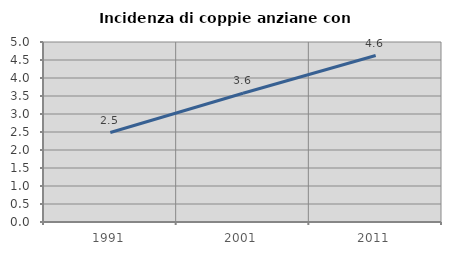
| Category | Incidenza di coppie anziane con figli |
|---|---|
| 1991.0 | 2.484 |
| 2001.0 | 3.576 |
| 2011.0 | 4.625 |